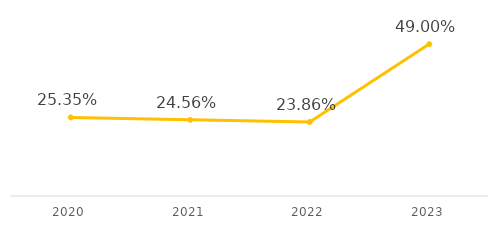
| Category | Series 0 |
|---|---|
| 2020.0 | 0.254 |
| 2021.0 | 0.246 |
| 2022.0 | 0.239 |
| 2023.0 | 0.49 |